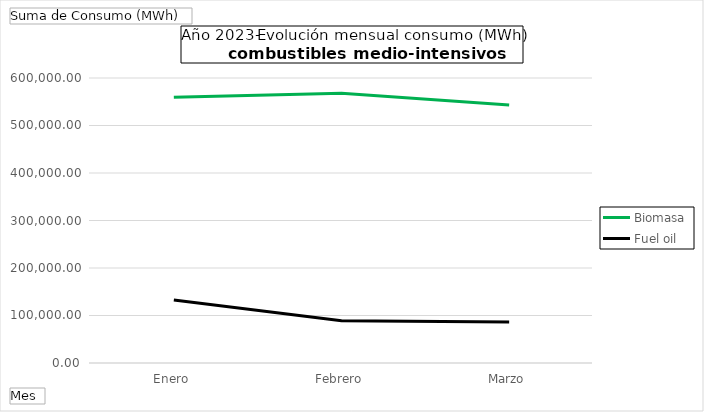
| Category | Biomasa | Fuel oil |
|---|---|---|
| Enero | 559533.61 | 132554.63 |
| Febrero | 567766.49 | 88948.18 |
| Marzo | 543216.95 | 86334.04 |